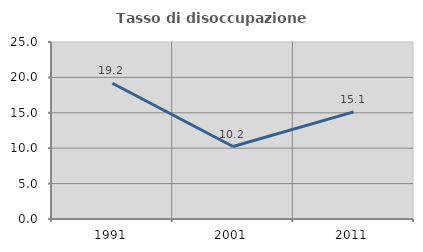
| Category | Tasso di disoccupazione giovanile  |
|---|---|
| 1991.0 | 19.18 |
| 2001.0 | 10.234 |
| 2011.0 | 15.126 |